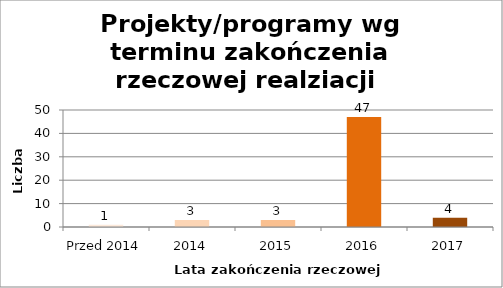
| Category | Series 0 |
|---|---|
| Przed 2014 | 1 |
| 2014 | 3 |
| 2015 | 3 |
| 2016 | 47 |
| 2017 | 4 |